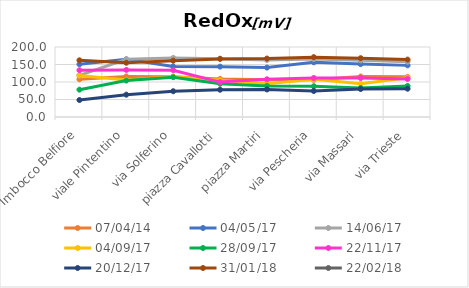
| Category | 07/04/14 | 04/05/17 | 14/06/17 | 04/09/17 | 28/09/17 | 22/11/17 | 20/12/17 | 31/01/18 | 22/02/18 |
|---|---|---|---|---|---|---|---|---|---|
| Imbocco Belfiore | 107.7 | 150.5 | 118.7 | 118.8 | 78.1 | 133.5 | 48.5 | 162 |  |
| viale Pintentino | 116 | 164.7 | 164.9 | 105.9 | 104.1 | 134.5 | 63.8 | 155 |  |
| via Solferino | 115.2 | 144.5 | 168.9 | 114.7 | 113.8 | 133.5 | 73.6 | 161 |  |
| piazza Cavallotti | 108.7 | 143.9 | 166.7 | 104.8 | 94.9 | 99.7 | 77.9 | 166 |  |
| piazza Martiri | 106.1 | 141.2 | 162.9 | 94.8 | 88.9 | 107.8 | 78.7 | 167 |  |
| via Pescheria | 106.1 | 156.2 | 165.7 | 107.6 | 87.9 | 111.5 | 74.3 | 171 |  |
| via Massari | 115.7 | 151.1 | 161.8 | 94.9 | 82.9 | 111.4 | 79.9 | 168 |  |
| via Trieste | 114.7 | 147.5 | 157.9 | 112.2 | 88.7 | 108.7 | 80.9 | 164 |  |